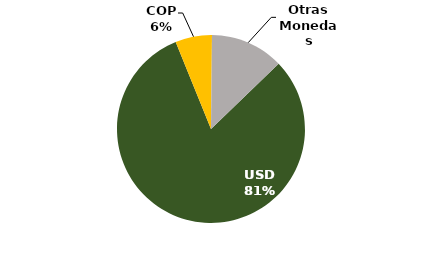
| Category | Series 0 |
|---|---|
| USD | 0.811 |
| COP | 0.063 |
| Otras Monedas | 0.126 |